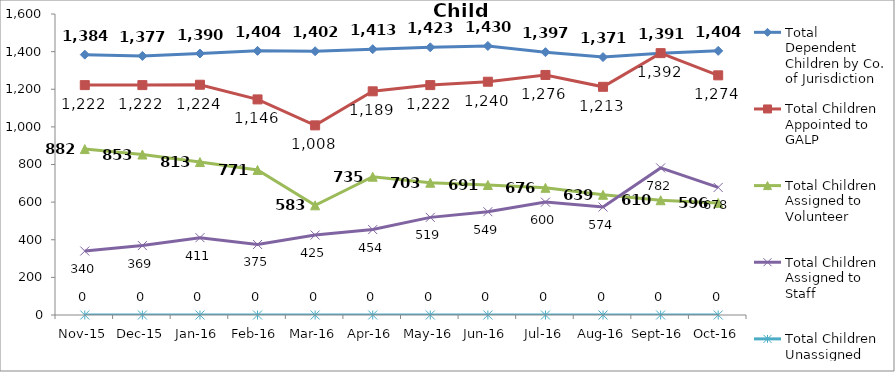
| Category | Total Dependent Children by Co. of Jurisdiction | Total Children Appointed to GALP | Total Children Assigned to Volunteer | Total Children Assigned to Staff | Total Children Unassigned |
|---|---|---|---|---|---|
| Nov-15 | 1384 | 1222 | 882 | 340 | 0 |
| Dec-15 | 1377 | 1222 | 853 | 369 | 0 |
| Jan-16 | 1390 | 1224 | 813 | 411 | 0 |
| Feb-16 | 1404 | 1146 | 771 | 375 | 0 |
| Mar-16 | 1402 | 1008 | 583 | 425 | 0 |
| Apr-16 | 1413 | 1189 | 735 | 454 | 0 |
| May-16 | 1423 | 1222 | 703 | 519 | 0 |
| Jun-16 | 1430 | 1240 | 691 | 549 | 0 |
| Jul-16 | 1397 | 1276 | 676 | 600 | 0 |
| Aug-16 | 1371 | 1213 | 639 | 574 | 0 |
| Sep-16 | 1391 | 1392 | 610 | 782 | 0 |
| Oct-16 | 1404 | 1274 | 596 | 678 | 0 |